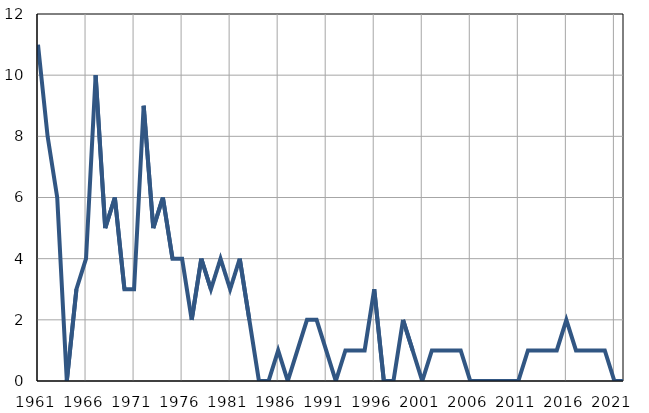
| Category | Infants
deaths |
|---|---|
| 1961.0 | 11 |
| 1962.0 | 8 |
| 1963.0 | 6 |
| 1964.0 | 0 |
| 1965.0 | 3 |
| 1966.0 | 4 |
| 1967.0 | 10 |
| 1968.0 | 5 |
| 1969.0 | 6 |
| 1970.0 | 3 |
| 1971.0 | 3 |
| 1972.0 | 9 |
| 1973.0 | 5 |
| 1974.0 | 6 |
| 1975.0 | 4 |
| 1976.0 | 4 |
| 1977.0 | 2 |
| 1978.0 | 4 |
| 1979.0 | 3 |
| 1980.0 | 4 |
| 1981.0 | 3 |
| 1982.0 | 4 |
| 1983.0 | 2 |
| 1984.0 | 0 |
| 1985.0 | 0 |
| 1986.0 | 1 |
| 1987.0 | 0 |
| 1988.0 | 1 |
| 1989.0 | 2 |
| 1990.0 | 2 |
| 1991.0 | 1 |
| 1992.0 | 0 |
| 1993.0 | 1 |
| 1994.0 | 1 |
| 1995.0 | 1 |
| 1996.0 | 3 |
| 1997.0 | 0 |
| 1998.0 | 0 |
| 1999.0 | 2 |
| 2000.0 | 1 |
| 2001.0 | 0 |
| 2002.0 | 1 |
| 2003.0 | 1 |
| 2004.0 | 1 |
| 2005.0 | 1 |
| 2006.0 | 0 |
| 2007.0 | 0 |
| 2008.0 | 0 |
| 2009.0 | 0 |
| 2010.0 | 0 |
| 2011.0 | 0 |
| 2012.0 | 1 |
| 2013.0 | 1 |
| 2014.0 | 1 |
| 2015.0 | 1 |
| 2016.0 | 2 |
| 2017.0 | 1 |
| 2018.0 | 1 |
| 2019.0 | 1 |
| 2020.0 | 1 |
| 2021.0 | 0 |
| 2022.0 | 0 |